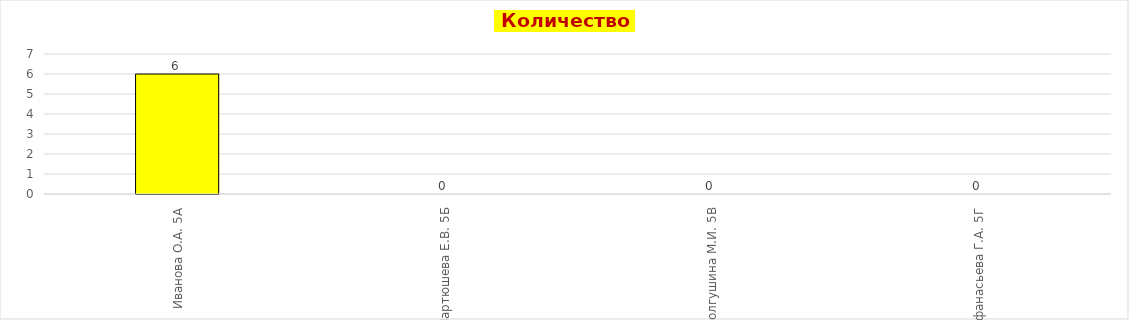
| Category | "2" |
|---|---|
| Иванова О.А. 5А | 6 |
| Мартюшева Е.В. 5Б | 0 |
| Долгушина М.И. 5В | 0 |
| Афанасьева Г.А. 5Г | 0 |